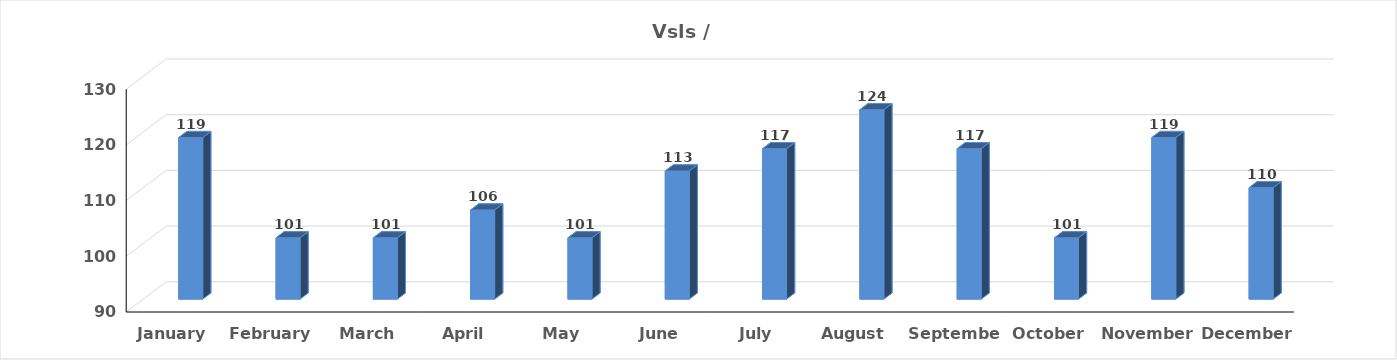
| Category | Vsls |
|---|---|
| January | 119 |
| February | 101 |
| March | 101 |
| April | 106 |
| May | 101 |
| June | 113 |
| July | 117 |
| August | 124 |
| September | 117 |
| October | 101 |
| November | 119 |
| December | 110 |